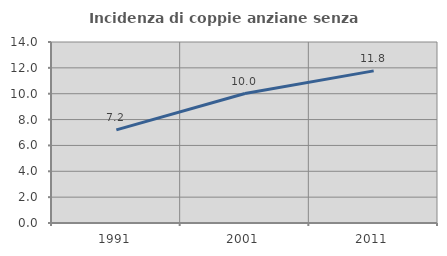
| Category | Incidenza di coppie anziane senza figli  |
|---|---|
| 1991.0 | 7.199 |
| 2001.0 | 10.014 |
| 2011.0 | 11.768 |